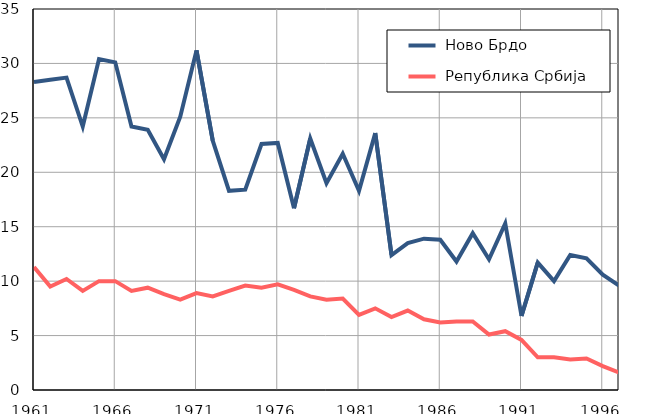
| Category |  Ново Брдо |  Република Србија |
|---|---|---|
| 1961.0 | 28.3 | 11.3 |
| 1962.0 | 28.5 | 9.5 |
| 1963.0 | 28.7 | 10.2 |
| 1964.0 | 24.2 | 9.1 |
| 1965.0 | 30.4 | 10 |
| 1966.0 | 30.1 | 10 |
| 1967.0 | 24.2 | 9.1 |
| 1968.0 | 23.9 | 9.4 |
| 1969.0 | 21.2 | 8.8 |
| 1970.0 | 25.1 | 8.3 |
| 1971.0 | 31.2 | 8.9 |
| 1972.0 | 22.9 | 8.6 |
| 1973.0 | 18.3 | 9.1 |
| 1974.0 | 18.4 | 9.6 |
| 1975.0 | 22.6 | 9.4 |
| 1976.0 | 22.7 | 9.7 |
| 1977.0 | 16.7 | 9.2 |
| 1978.0 | 23.1 | 8.6 |
| 1979.0 | 19 | 8.3 |
| 1980.0 | 21.7 | 8.4 |
| 1981.0 | 18.3 | 6.9 |
| 1982.0 | 23.6 | 7.5 |
| 1983.0 | 12.4 | 6.7 |
| 1984.0 | 13.5 | 7.3 |
| 1985.0 | 13.9 | 6.5 |
| 1986.0 | 13.8 | 6.2 |
| 1987.0 | 11.8 | 6.3 |
| 1988.0 | 14.4 | 6.3 |
| 1989.0 | 12 | 5.1 |
| 1990.0 | 15.3 | 5.4 |
| 1991.0 | 6.8 | 4.6 |
| 1992.0 | 11.7 | 3 |
| 1993.0 | 10 | 3 |
| 1994.0 | 12.4 | 2.8 |
| 1995.0 | 12.1 | 2.9 |
| 1996.0 | 10.6 | 2.2 |
| 1997.0 | 9.6 | 1.6 |